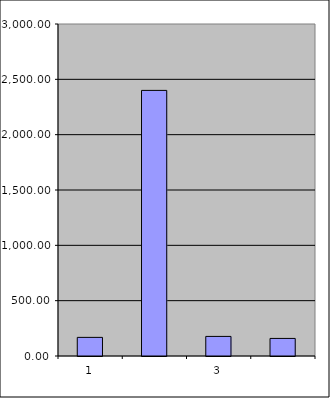
| Category | Series 0 |
|---|---|
| 0 | 168.25 |
| 1 | 2400.044 |
| 2 | 177.013 |
| 3 | 158.831 |